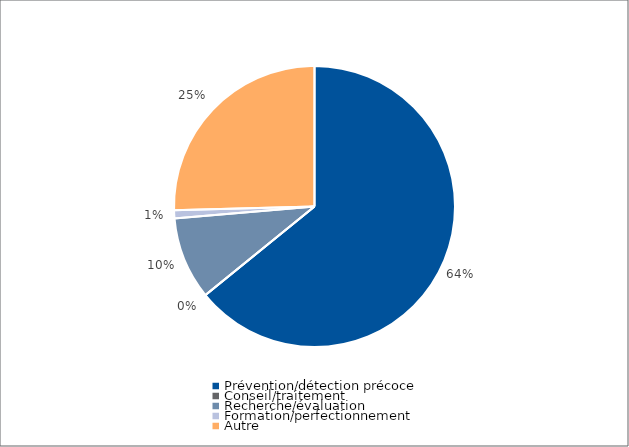
| Category | Series 0 |
|---|---|
| Prévention/détection précoce | 255423 |
| Conseil/traitement | 0 |
| Recherche/évaluation | 37848 |
| Formation/perfectionnement | 3712 |
| Autre | 101226 |